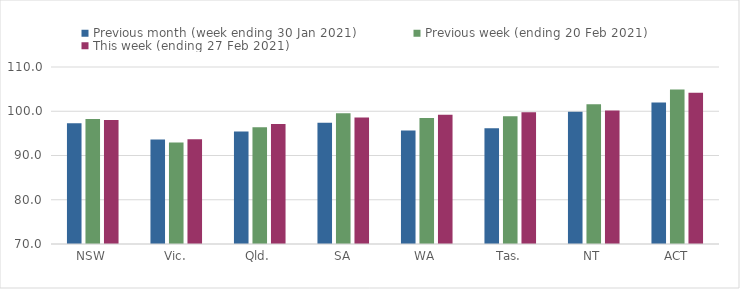
| Category | Previous month (week ending 30 Jan 2021) | Previous week (ending 20 Feb 2021) | This week (ending 27 Feb 2021) |
|---|---|---|---|
| NSW | 97.28 | 98.24 | 98.02 |
| Vic. | 93.64 | 92.95 | 93.66 |
| Qld. | 95.4 | 96.37 | 97.12 |
| SA | 97.41 | 99.56 | 98.61 |
| WA | 95.63 | 98.49 | 99.23 |
| Tas. | 96.14 | 98.89 | 99.75 |
| NT | 99.87 | 101.56 | 100.17 |
| ACT | 101.98 | 104.9 | 104.2 |